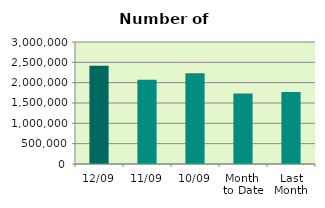
| Category | Series 0 |
|---|---|
| 12/09 | 2414502 |
| 11/09 | 2070052 |
| 10/09 | 2229458 |
| Month 
to Date | 1732734.444 |
| Last
Month | 1768562.909 |